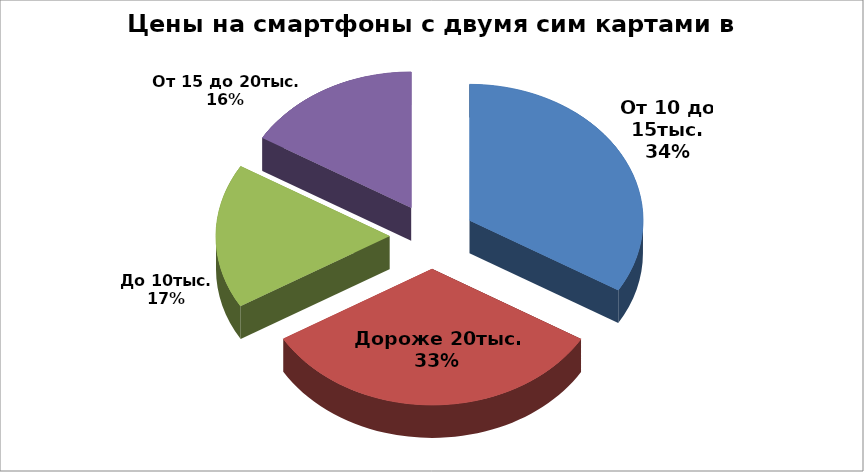
| Category | Series 0 |
|---|---|
| От 10 до 15тыс. | 43 |
| Дороже 20тыс. | 42 |
| До 10тыс. | 22 |
| От 15 до 20тыс. | 21 |